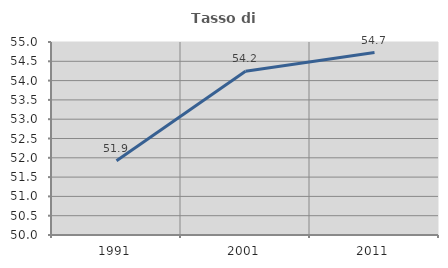
| Category | Tasso di occupazione   |
|---|---|
| 1991.0 | 51.922 |
| 2001.0 | 54.244 |
| 2011.0 | 54.726 |